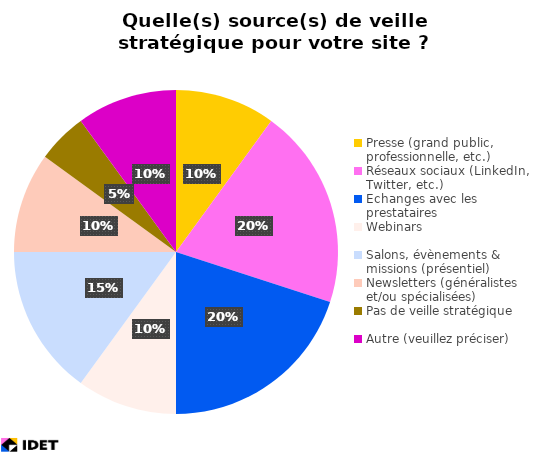
| Category | Series 1 |
|---|---|
| Presse (grand public, professionnelle, etc.) | 2 |
| Réseaux sociaux (LinkedIn, Twitter, etc.) | 4 |
| Echanges avec les prestataires | 4 |
| Webinars | 2 |
| Salons, évènements & missions (présentiel) | 3 |
| Newsletters (généralistes et/ou spécialisées) | 2 |
| Pas de veille stratégique | 1 |
| Autre (veuillez préciser) | 2 |